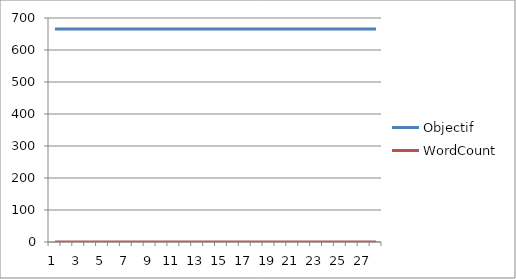
| Category | Objectif | WordCount |
|---|---|---|
| 0 | 666 | 0 |
| 1 | 666 | 0 |
| 2 | 666 | 0 |
| 3 | 666 | 0 |
| 4 | 666 | 0 |
| 5 | 666 | 0 |
| 6 | 666 | 0 |
| 7 | 666 | 0 |
| 8 | 666 | 0 |
| 9 | 666 | 0 |
| 10 | 666 | 0 |
| 11 | 666 | 0 |
| 12 | 666 | 0 |
| 13 | 666 | 0 |
| 14 | 666 | 0 |
| 15 | 666 | 0 |
| 16 | 666 | 0 |
| 17 | 666 | 0 |
| 18 | 666 | 0 |
| 19 | 666 | 0 |
| 20 | 666 | 0 |
| 21 | 666 | 0 |
| 22 | 666 | 0 |
| 23 | 666 | 0 |
| 24 | 666 | 0 |
| 25 | 666 | 0 |
| 26 | 666 | 0 |
| 27 | 666 | 0 |